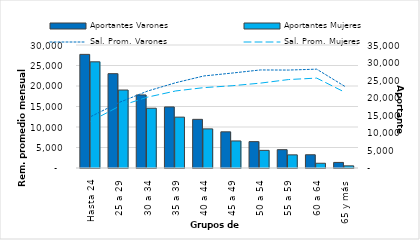
| Category | Aportantes Varones | Aportantes Mujeres |
|---|---|---|
| 0 | 32329 | 30215 |
| 1 | 26842 | 22188 |
| 2 | 20787 | 17010 |
| 3 | 17372 | 14475 |
| 4 | 13842 | 11131 |
| 5 | 10294 | 7697 |
| 6 | 7505 | 5019 |
| 7 | 5215 | 3741 |
| 8 | 3766 | 1350 |
| 9 | 1585 | 611 |